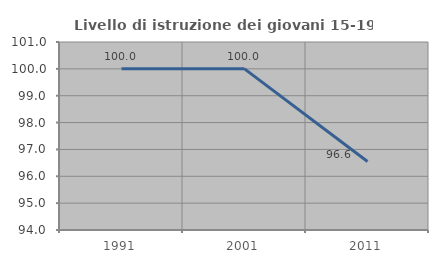
| Category | Livello di istruzione dei giovani 15-19 anni |
|---|---|
| 1991.0 | 100 |
| 2001.0 | 100 |
| 2011.0 | 96.552 |